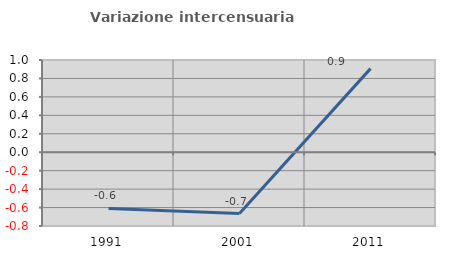
| Category | Variazione intercensuaria annua |
|---|---|
| 1991.0 | -0.61 |
| 2001.0 | -0.666 |
| 2011.0 | 0.907 |